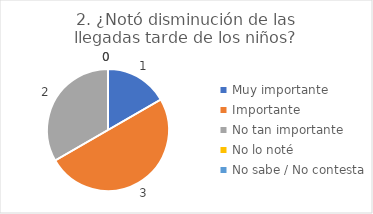
| Category | 2. ¿Notó disminución de las llegadas tarde de los niños? |
|---|---|
| Muy importante  | 0.167 |
| Importante  | 0.5 |
| No tan importante  | 0.333 |
| No lo noté  | 0 |
| No sabe / No contesta | 0 |